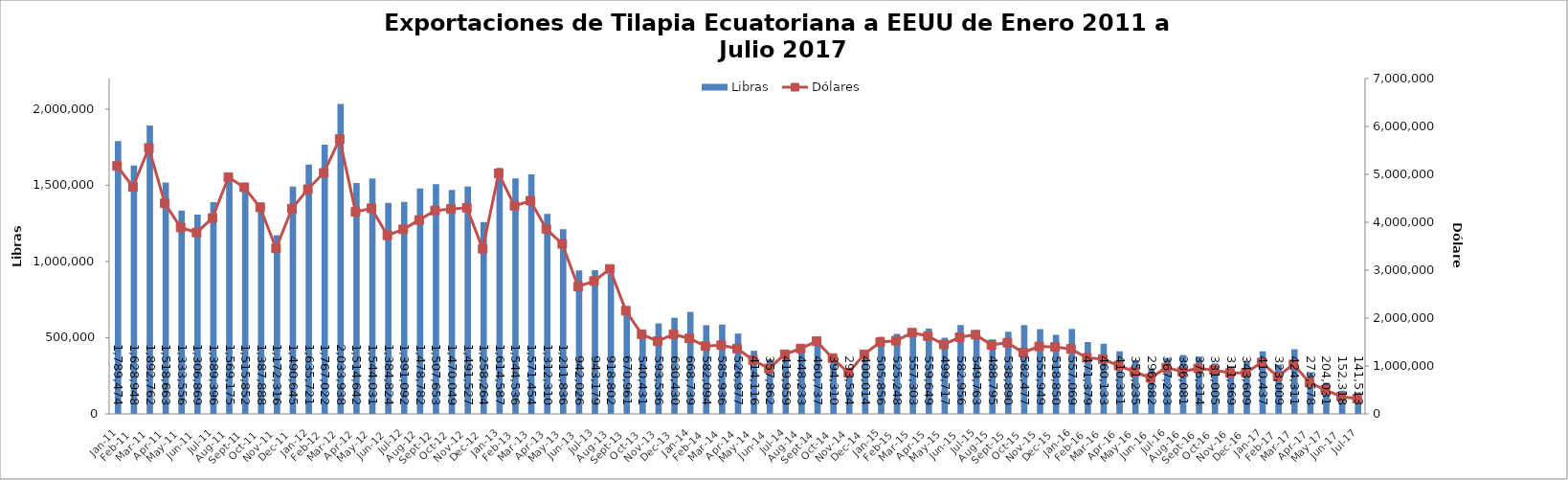
| Category | Libras  |
|---|---|
| 2011-01-01 | 1789473.82 |
| 2011-02-01 | 1628948.076 |
| 2011-03-01 | 1892761.535 |
| 2011-04-01 | 1518662.961 |
| 2011-05-01 | 1333555.926 |
| 2011-06-01 | 1306869.243 |
| 2011-07-01 | 1389396.24 |
| 2011-08-01 | 1569174.756 |
| 2011-09-01 | 1515852.096 |
| 2011-10-01 | 1387888.293 |
| 2011-11-01 | 1172315.891 |
| 2011-12-01 | 1490644.699 |
| 2012-01-01 | 1635720.607 |
| 2012-02-01 | 1767022.174 |
| 2012-03-01 | 2033937.505 |
| 2012-04-01 | 1514641.77 |
| 2012-05-01 | 1544031.293 |
| 2012-06-01 | 1384823.899 |
| 2012-07-01 | 1391091.577 |
| 2012-08-01 | 1478781.747 |
| 2012-09-01 | 1507653.188 |
| 2012-10-01 | 1470049.326 |
| 2012-11-01 | 1491526.539 |
| 2012-12-01 | 1258264 |
| 2013-01-01 | 1614587 |
| 2013-02-01 | 1544536.146 |
| 2013-03-01 | 1571454.312 |
| 2013-04-01 | 1312310.196 |
| 2013-05-01 | 1211835.551 |
| 2013-06-01 | 942025.58 |
| 2013-07-01 | 943178.586 |
| 2013-08-01 | 918802.324 |
| 2013-09-01 | 670961.192 |
| 2013-10-01 | 540431.235 |
| 2013-11-01 | 593535.64 |
| 2013-12-01 | 630429.621 |
| 2014-01-01 | 668739 |
| 2014-02-01 | 582093.766 |
| 2014-03-01 | 585936.383 |
| 2014-04-01 | 526976.561 |
| 2014-05-01 | 414116.473 |
| 2014-06-01 | 357861.695 |
| 2014-07-01 | 419958.663 |
| 2014-08-01 | 448233 |
| 2014-09-01 | 460737.149 |
| 2014-10-01 | 394310.347 |
| 2014-11-01 | 293533.672 |
| 2014-12-01 | 400013.647 |
| 2015-01-01 | 505856.493 |
| 2015-02-01 | 525248 |
| 2015-03-01 | 557303.039 |
| 2015-04-01 | 559648.733 |
| 2015-05-01 | 499716.682 |
| 2015-06-01 | 582955.764 |
| 2015-07-01 | 549763.307 |
| 2015-08-01 | 488795.094 |
| 2015-09-01 | 538890.219 |
| 2015-10-01 | 582477.366 |
| 2015-11-01 | 555949.414 |
| 2015-12-01 | 518850.405 |
| 2016-01-01 | 557069.351 |
| 2016-02-01 | 471378.754 |
| 2016-03-01 | 460133.089 |
| 2016-04-01 | 410331.175 |
| 2016-05-01 | 351235 |
| 2016-06-01 | 296682 |
| 2016-07-01 | 367233.45 |
| 2016-08-01 | 386080.575 |
| 2016-09-01 | 376314.197 |
| 2016-10-01 | 331005.258 |
| 2016-11-01 | 311968.537 |
| 2016-12-01 | 343608.956 |
| 2017-01-01 | 410436.996 |
| 2017-02-01 | 323009.174 |
| 2017-03-01 | 424310.544 |
| 2017-04-01 | 273577.632 |
| 2017-05-01 | 204031.321 |
| 2017-06-01 | 152318.019 |
| 2017-07-01 | 141513.274 |